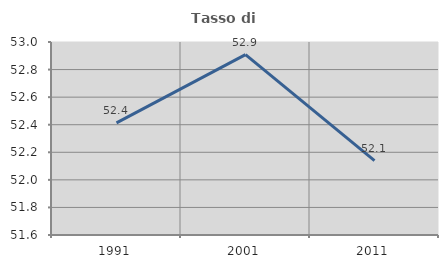
| Category | Tasso di occupazione   |
|---|---|
| 1991.0 | 52.413 |
| 2001.0 | 52.908 |
| 2011.0 | 52.139 |